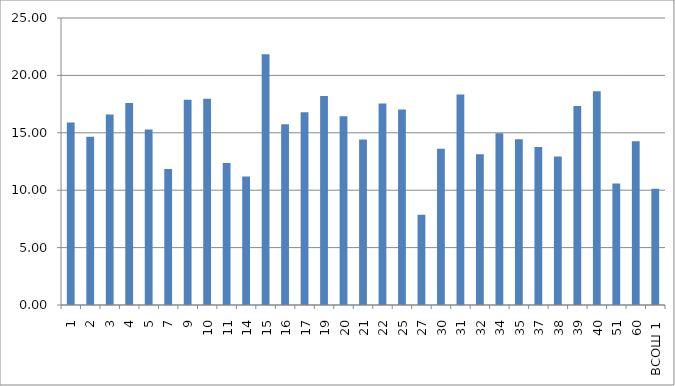
| Category | Series 0 |
|---|---|
| 1 | 15.902 |
| 2 | 14.652 |
| 3 | 16.6 |
| 4 | 17.604 |
| 5 | 15.292 |
| 7 | 11.844 |
| 9 | 17.882 |
| 10 | 17.97 |
| 11 | 12.375 |
| 14 | 11.2 |
| 15 | 21.836 |
| 16 | 15.743 |
| 17 | 16.8 |
| 19 | 18.216 |
| 20 | 16.442 |
| 21 | 14.426 |
| 22 | 17.547 |
| 25 | 17.033 |
| 27 | 7.862 |
| 30 | 13.615 |
| 31 | 18.333 |
| 32 | 13.125 |
| 34 | 14.964 |
| 35 | 14.447 |
| 37 | 13.763 |
| 38 | 12.932 |
| 39 | 17.333 |
| 40 | 18.619 |
| 51 | 10.591 |
| 60 | 14.273 |
| ВСОШ 1 | 10.12 |